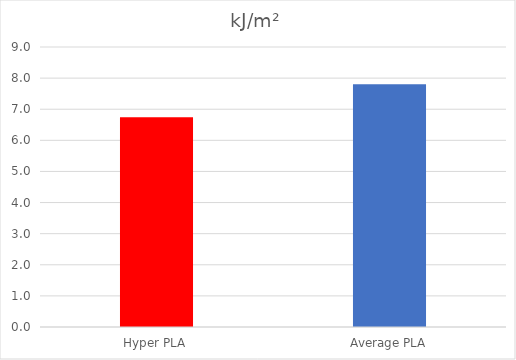
| Category | kJ/m² |
|---|---|
| Hyper PLA | 6.744 |
| Average PLA | 7.8 |